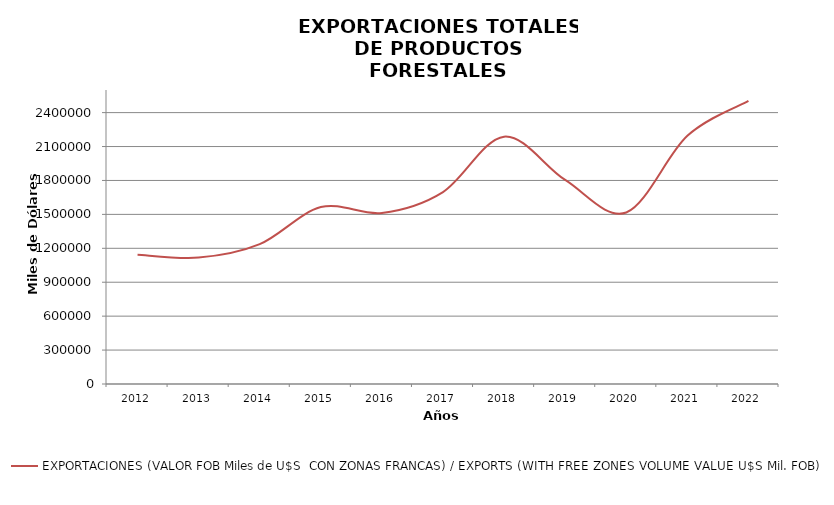
| Category | EXPORTACIONES (VALOR FOB Miles de U$S  CON ZONAS FRANCAS) / EXPORTS (WITH FREE ZONES VOLUME VALUE U$S Mil. FOB) |
|---|---|
| 2012.0 | 1143485.85 |
| 2013.0 | 1117961.004 |
| 2014.0 | 1236849.234 |
| 2015.0 | 1564529.97 |
| 2016.0 | 1512855.911 |
| 2017.0 | 1697667.265 |
| 2018.0 | 2187564.243 |
| 2019.0 | 1804711.611 |
| 2020.0 | 1517099.022 |
| 2021.0 | 2194748.925 |
| 2022.0 | 2503324.775 |